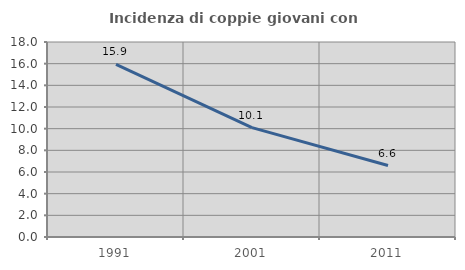
| Category | Incidenza di coppie giovani con figli |
|---|---|
| 1991.0 | 15.931 |
| 2001.0 | 10.096 |
| 2011.0 | 6.594 |